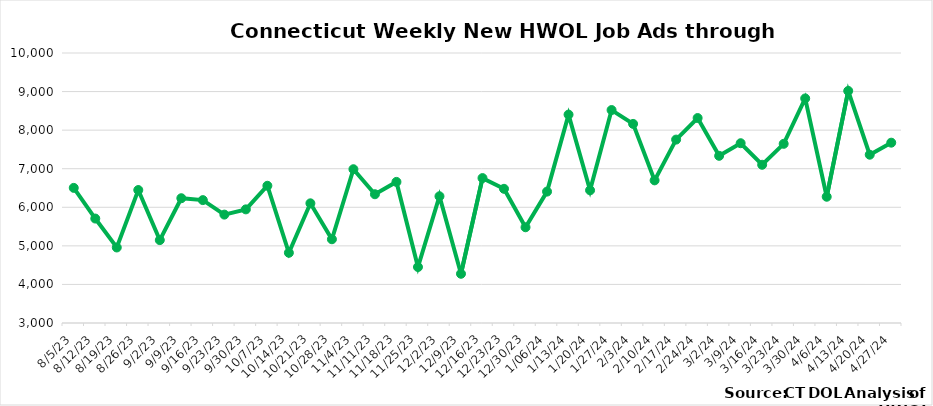
| Category | Connecticut |
|---|---|
| 8/5/23 | 6503 |
| 8/12/23 | 5708 |
| 8/19/23 | 4958 |
| 8/26/23 | 6447 |
| 9/2/23 | 5149 |
| 9/9/23 | 6235 |
| 9/16/23 | 6186 |
| 9/23/23 | 5810 |
| 9/30/23 | 5946 |
| 10/7/23 | 6558 |
| 10/14/23 | 4820 |
| 10/21/23 | 6103 |
| 10/28/23 | 5171 |
| 11/4/23 | 6987 |
| 11/11/23 | 6338 |
| 11/18/23 | 6658 |
| 11/25/23 | 4451 |
| 12/2/23 | 6286 |
| 12/9/23 | 4276 |
| 12/16/23 | 6757 |
|  12/23/23 | 6479 |
|  12/30/23 | 5482 |
|  1/06/24 | 6407 |
|  1/13/24 | 8403 |
|  1/20/24 | 6441 |
|  1/27/24 | 8521 |
|  2/3/24 | 8162 |
|  2/10/24 | 6698 |
|  2/17/24 | 7755 |
|  2/24/24 | 8314 |
|  3/2/24 | 7334 |
|  3/9/24 | 7661 |
|  3/16/24 | 7102 |
|  3/23/24 | 7645 |
|  3/30/24 | 8822 |
|  4/6/24 | 6273 |
|  4/13/24 | 9017 |
|  4/20/24 | 7363 |
|  4/27/24 | 7675 |